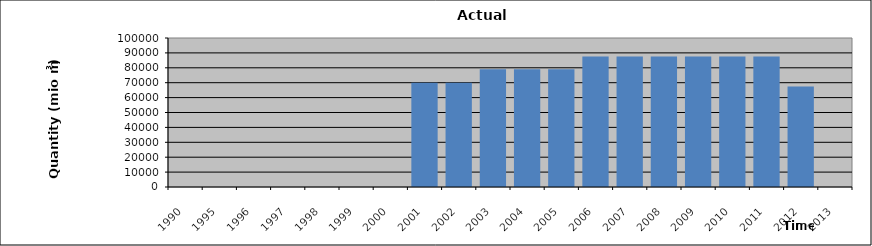
| Category | 1990 1995 1996 1997 1998 1999 2000 2001 2002 2003 2004 2005 2006 2007 2008 2009 2010 2011 2012 2013 |
|---|---|
| 1990.0 | 0 |
| 1995.0 | 0 |
| 1996.0 | 0 |
| 1997.0 | 0 |
| 1998.0 | 0 |
| 1999.0 | 0 |
| 2000.0 | 0 |
| 2001.0 | 70000 |
| 2002.0 | 70000 |
| 2003.0 | 79000 |
| 2004.0 | 79000 |
| 2005.0 | 79000 |
| 2006.0 | 87600 |
| 2007.0 | 87600 |
| 2008.0 | 87600 |
| 2009.0 | 87600 |
| 2010.0 | 87600 |
| 2011.0 | 87600 |
| 2012.0 | 67500 |
| 2013.0 | 0 |